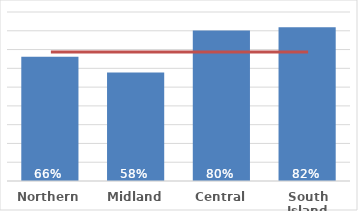
| Category | Pacific |
|---|---|
| Northern | 0.662 |
| Midland | 0.577 |
| Central | 0.802 |
| South Island | 0.818 |